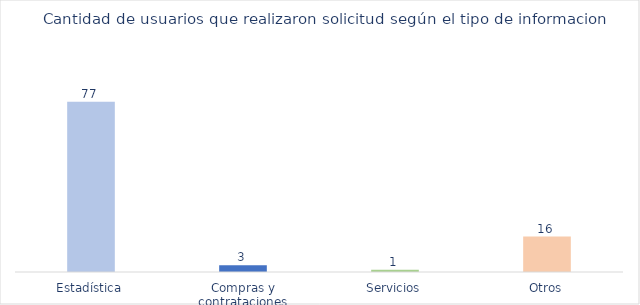
| Category | Cantidad |
|---|---|
| Estadística | 77 |
| Compras y contrataciones | 3 |
| Servicios | 1 |
| Otros | 16 |